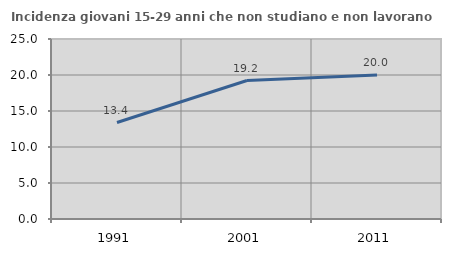
| Category | Incidenza giovani 15-29 anni che non studiano e non lavorano  |
|---|---|
| 1991.0 | 13.402 |
| 2001.0 | 19.231 |
| 2011.0 | 20 |